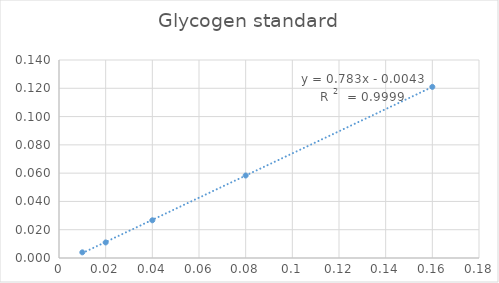
| Category | Series 0 |
|---|---|
| 0.01 | 0.004 |
| 0.02 | 0.011 |
| 0.04 | 0.027 |
| 0.08 | 0.058 |
| 0.16 | 0.121 |